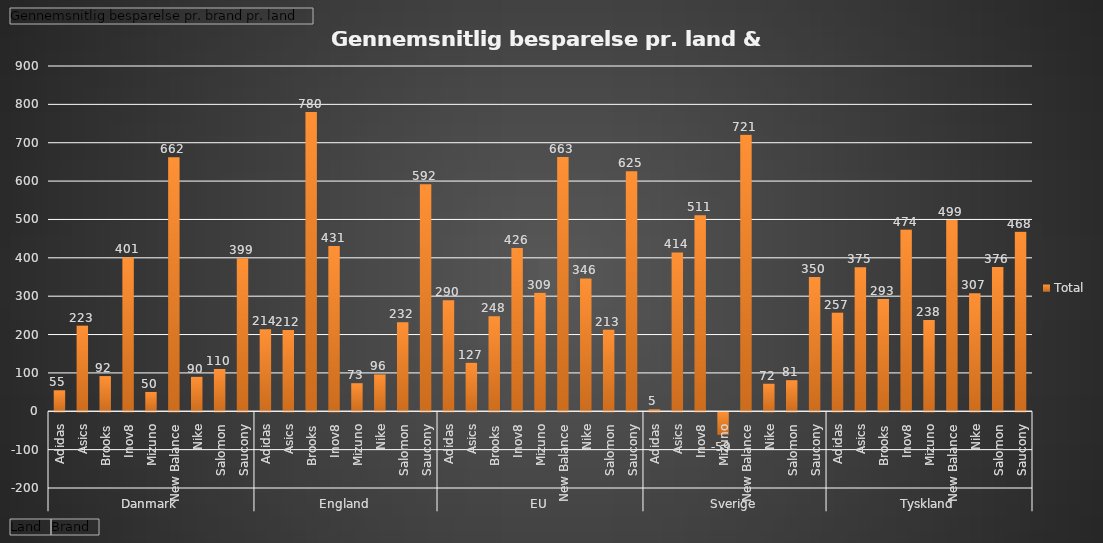
| Category | Total |
|---|---|
| 0 | 54.774 |
| 1 | 223.271 |
| 2 | 91.776 |
| 3 | 401.179 |
| 4 | 50.4 |
| 5 | 662 |
| 6 | 89.931 |
| 7 | 110.152 |
| 8 | 398.986 |
| 9 | 213.858 |
| 10 | 211.764 |
| 11 | 780.147 |
| 12 | 430.633 |
| 13 | 73.172 |
| 14 | 96.101 |
| 15 | 231.964 |
| 16 | 592.082 |
| 17 | 289.6 |
| 18 | 126.5 |
| 19 | 248 |
| 20 | 425.8 |
| 21 | 308.9 |
| 22 | 663 |
| 23 | 346.32 |
| 24 | 213 |
| 25 | 625.381 |
| 26 | 5 |
| 27 | 414 |
| 28 | 511 |
| 29 | -58.8 |
| 30 | 721 |
| 31 | 72.2 |
| 32 | 81 |
| 33 | 349.88 |
| 34 | 257.437 |
| 35 | 375.245 |
| 36 | 292.795 |
| 37 | 473.73 |
| 38 | 237.759 |
| 39 | 498.751 |
| 40 | 307.482 |
| 41 | 376.176 |
| 42 | 468.097 |